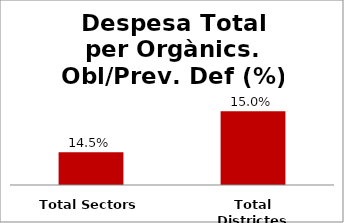
| Category | Series 0 |
|---|---|
| Total Sectors | 0.145 |
| Total Districtes | 0.15 |